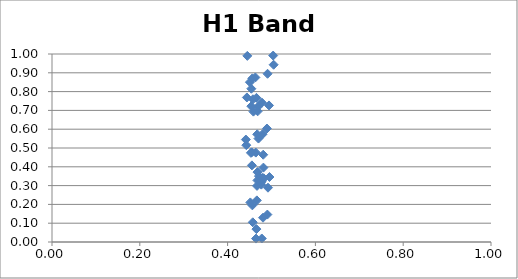
| Category | H1 Band 3 |
|---|---|
| 0.4416191548099777 | 0.545 |
| 0.4426041606008622 | 0.515 |
| 0.4439346178955026 | 0.769 |
| 0.4449216096849407 | 0.99 |
| 0.45077868287626444 | 0.85 |
| 0.45177138854146665 | 0.21 |
| 0.45311217416841176 | 0.474 |
| 0.4540351723016773 | 0.722 |
| 0.45410677452705567 | 0.815 |
| 0.4550305145855629 | 0.477 |
| 0.455394060673084 | 0.407 |
| 0.45637483563846415 | 0.195 |
| 0.4563904875100915 | 0.87 |
| 0.4573720395127507 | 0.105 |
| 0.45773626263470973 | 0.759 |
| 0.4587345371502176 | 0.693 |
| 0.463288439954147 | 0.875 |
| 0.4642909846875446 | 0.476 |
| 0.46465714988173734 | 0.018 |
| 0.4656449597941666 | 0.069 |
| 0.46566072356891625 | 0.767 |
| 0.46664927024955166 | 0.221 |
| 0.4670160773915513 | 0.298 |
| 0.4674886708158737 | 0.573 |
| 0.4679490304292352 | 0.328 |
| 0.46802140239561624 | 0.372 |
| 0.4684943433255579 | 0.695 |
| 0.4689550403707317 | 0.719 |
| 0.4703136580586718 | 0.55 |
| 0.4713213844367736 | 0.35 |
| 0.4768353608038024 | 0.305 |
| 0.4772987668383699 | 0.32 |
| 0.4778476754391094 | 0.019 |
| 0.4783113993471143 | 0.741 |
| 0.47967888525850405 | 0.573 |
| 0.4801556813814101 | 0.341 |
| 0.480693133346126 | 0.129 |
| 0.48117024967296085 | 0.464 |
| 0.48154078485662827 | 0.396 |
| 0.4825562768378622 | 0.338 |
| 0.4895825543613378 | 0.604 |
| 0.49060321750806185 | 0.146 |
| 0.49097596649102077 | 0.895 |
| 0.49199749234914386 | 0.289 |
| 0.49432622613540483 | 0.726 |
| 0.49534978590253076 | 0.346 |
| 0.5038338106224641 | 0.992 |
| 0.5048628310268446 | 0.943 |